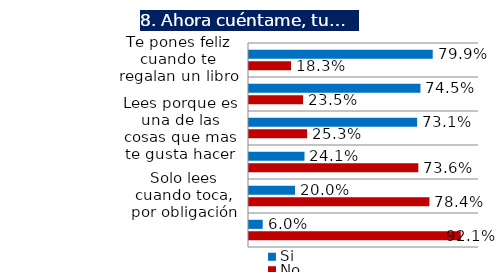
| Category | Si | No |
|---|---|---|
| Te pones feliz cuando te regalan un libro | 0.799 | 0.183 |
| Te encanta o te encantaría ir a una biblioteca | 0.745 | 0.235 |
| Lees porque es una de las cosas que mas te gusta hacer | 0.731 | 0.253 |
| Piensas que es  difícil terminar de leer un libro  | 0.241 | 0.736 |
| Solo lees cuando toca, por obligación | 0.2 | 0.784 |
| Piensas que leer es perder el tiempo | 0.06 | 0.921 |